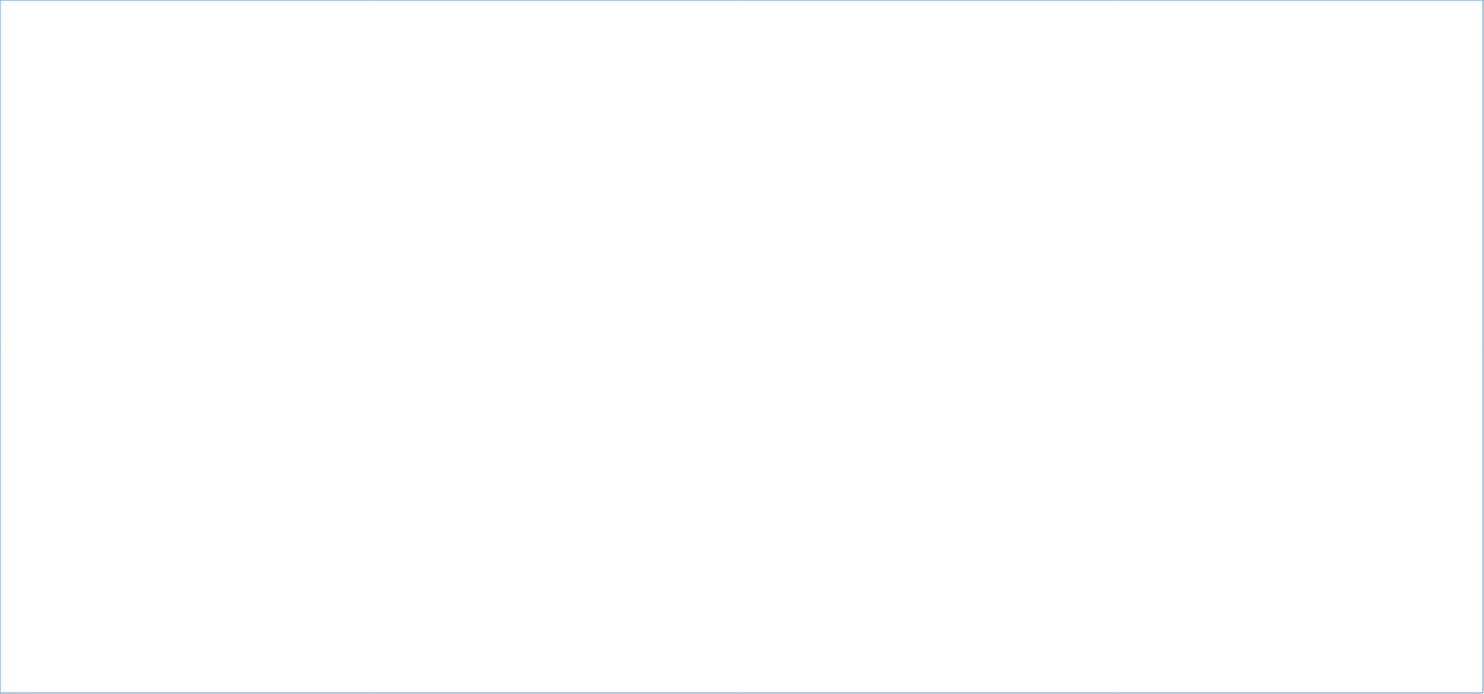
| Category | Total Population | # of People adopt basic personal and community hygiene practices | # of people access to functioning  sanitation facilities | # of people Equitable and continuous access to sufficient quantity of domestic water |
|---|---|---|---|---|
| Ah Nauk Ywe | 4836 | 4836 | 4629 | 4836 |
| Basare | 2111 | 1910 | 2111 | 2111 |
| Baw Du Pha 1 | 4892 | 4892 | 4892 | 4892 |
| Baw Du Pha 2 | 6936 | 6615 | 5060 | 6936 |
| Dar Pai | 11625 | 9245 | 8770 | 11625 |
| Dar Pai (IDP in host families) | 3360 | 2990 | 500 | 3360 |
| Kyauk Ta Lone | 974 | 974 | 974 | 974 |
| Kyein Ni Pyin | 6037 | 6037 | 3370 | 6037 |
| Maw Ti Ngar | 3486 | 0 | 3486 | 3486 |
| Nget Chaung 1 | 4671 | 4671 | 3134 | 4671 |
| Nget Chaung 2 | 4676 | 4676 | 3483 | 4676 |
| NiDin | 581 | 0 | 581 | 0 |
| Ohn Taw Chay | 3095 | 3095 | 3095 | 3095 |
| Ohn Taw Gyi (North) | 13302 | 13302 | 10090 | 13302 |
| Ohn Taw Gyi (South) | 11396 | 11396 | 11396 | 11396 |
| Say Tha Mar Gyi | 11564 | 11564 | 11564 | 11564 |
| Sin Tet Maw | 2805 | 2805 | 2805 | 2805 |
| Taung Paw | 2920 | 2920 | 2920 | 2920 |
| Thae Chaung | 6016 | 5580 | 3910 | 6016 |
| Thet Kae Pyin  | 5950 | 5950 | 5210 | 5950 |
| Thet Kae Pyin Village (IDPs in host family) | 1670 | 1670 | 0 | 1670 |
| Khaung Doke Khar 2 (Hmanzi) | 2186 | 2186 | 2186 | 2186 |
| Khaung Doke Khar 1 | 2248 | 2248 | 2130 | 2248 |
| Phwe Yar Kone (Say Tha Mar Gyi) | 2285 | 2285 | 2285 | 2285 |
| Baw Du Pha Village (IDP in host families) | 114 | 114 | 0 | 0 |